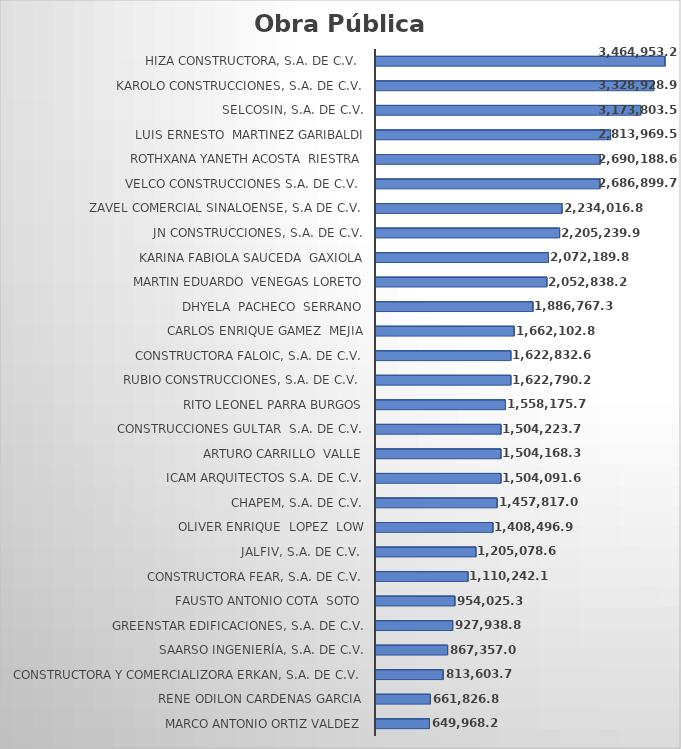
| Category | Suma  |
|---|---|
| Marco Antonio Ortiz Valdez | 649968.25 |
| Rene Odilon Cardenas Garcia | 661826.85 |
| CONSTRUCTORA Y COMERCIALIZORA ERKAN, S.A. DE C.V. | 813603.75 |
| SAARSO INGENIERÍA, S.A. DE C.V. | 867357.09 |
| GREENSTAR EDIFICACIONES, S.A. DE C.V. | 927938.81 |
| Fausto Antonio Cota  Soto | 954025.38 |
| CONSTRUCTORA FEAR, S.A. DE C.V. | 1110242.16 |
| JALFIV, S.A. de C.V.  | 1205078.61 |
| Oliver Enrique  Lopez  Low | 1408496.96 |
| CHAPEM, S.A. DE C.V. | 1457817.01 |
| ICAM ARQUITECTOS S.A. DE C.V. | 1504091.68 |
| Arturo Carrillo  Valle | 1504168.38 |
| CONSTRUCCIONES GULTAR  S.A. DE C.V. | 1504223.76 |
| Rito Leonel Parra Burgos | 1558175.71 |
| Rubio Construcciones, S.A. de C.V.  | 1622790.21 |
| Constructora FALOIC, S.A. de C.V. | 1622832.61 |
| Carlos Enrique Gamez  Mejia | 1662102.83 |
| Dhyela  Pacheco  Serrano | 1886767.36 |
| Martin Eduardo  Venegas Loreto | 2052838.22 |
| Karina Fabiola Sauceda  Gaxiola | 2072189.89 |
| JN CONSTRUCCIONES, S.A. DE C.V. | 2205239.98 |
| Zavel Comercial Sinaloense, S.A de C.V.  | 2234016.86 |
| VELCO CONSTRUCCIONES S.A. DE C.V.  | 2686899.7 |
| Rothxana Yaneth Acosta  Riestra | 2690188.69 |
| Luis Ernesto  Martinez Garibaldi | 2813969.55 |
| SELCOSIN, S.A. DE C.V. | 3173803.55 |
| KAROLO CONSTRUCCIONES, S.A. DE C.V. | 3328928.9 |
| HIZA Constructora, S.A. de C.V.  | 3464953.25 |